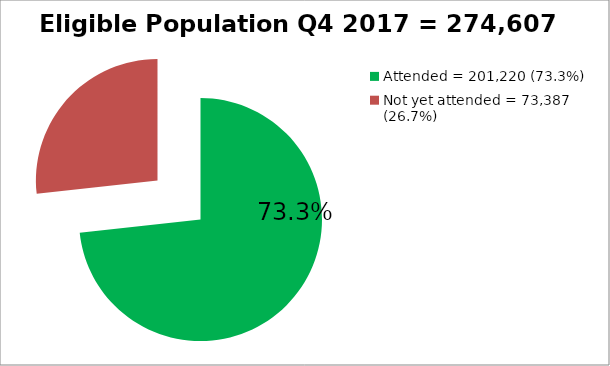
| Category | Eligible Population Q4 2017= 274,607 |
|---|---|
| Attended = 201,220 (73.3%) | 201220 |
| Not yet attended = 73,387 (26.7%)  | 73387 |